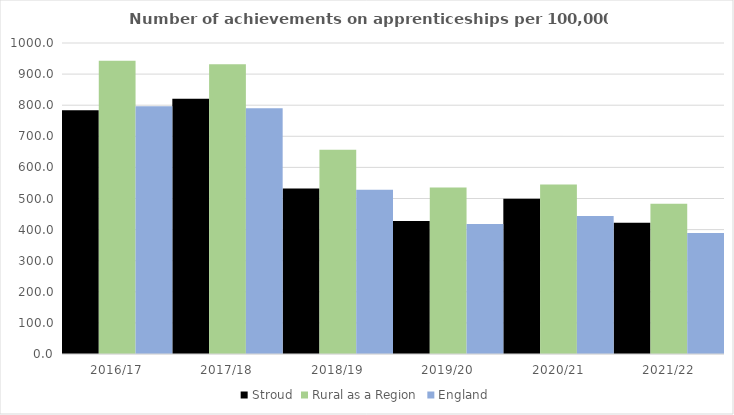
| Category | Stroud | Rural as a Region | England |
|---|---|---|---|
| 2016/17 | 784 | 942.594 | 797 |
| 2017/18 | 821 | 931.709 | 790 |
| 2018/19 | 532 | 656.44 | 528 |
| 2019/20 | 428 | 535.552 | 418 |
| 2020/21 | 499 | 545.333 | 444 |
| 2021/22 | 422 | 482.936 | 389 |